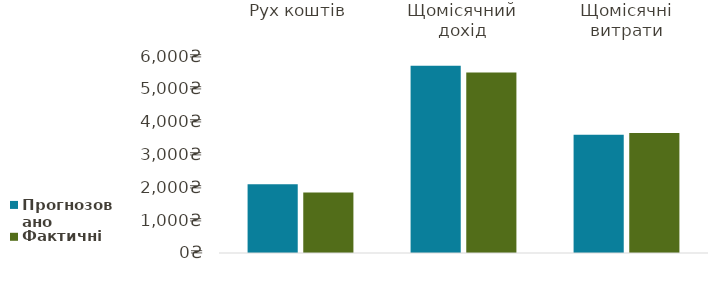
| Category | Прогнозовано | Фактичні |
|---|---|---|
| Рух коштів | 2097 | 1845 |
| Щомісячний дохід | 5700 | 5500 |
| Щомісячні витрати | 3603 | 3655 |